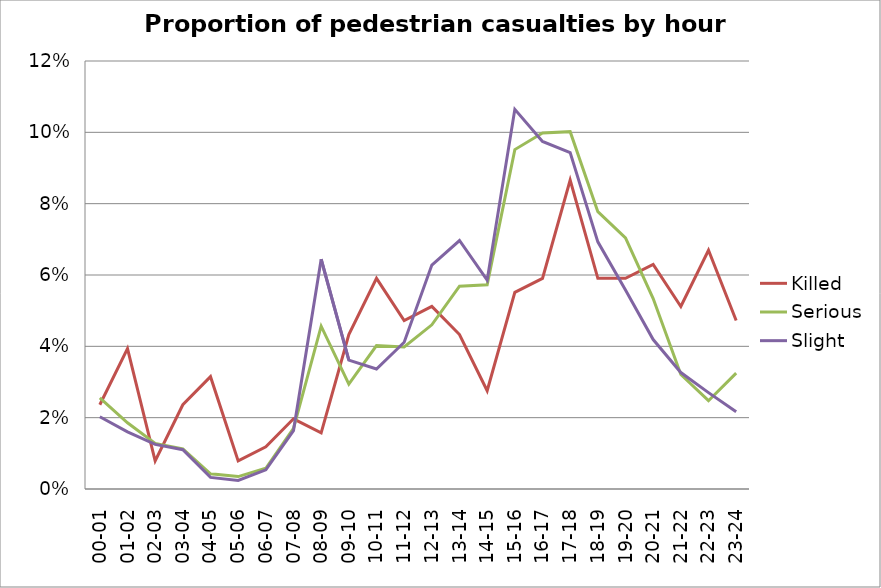
| Category | Killed | Serious | Slight |
|---|---|---|---|
| 00-01 | 0.024 | 0.026 | 0.02 |
| 01-02 | 0.039 | 0.019 | 0.016 |
| 02-03 | 0.008 | 0.013 | 0.013 |
| 03-04 | 0.024 | 0.011 | 0.011 |
| 04-05 | 0.031 | 0.004 | 0.003 |
| 05-06 | 0.008 | 0.003 | 0.002 |
| 06-07 | 0.012 | 0.006 | 0.005 |
| 07-08 | 0.02 | 0.017 | 0.016 |
| 08-09 | 0.016 | 0.046 | 0.064 |
| 09-10 | 0.043 | 0.029 | 0.036 |
| 10-11 | 0.059 | 0.04 | 0.034 |
| 11-12 | 0.047 | 0.04 | 0.041 |
| 12-13 | 0.051 | 0.046 | 0.063 |
| 13-14 | 0.043 | 0.057 | 0.07 |
| 14-15 | 0.028 | 0.057 | 0.059 |
| 15-16 | 0.055 | 0.095 | 0.106 |
| 16-17 | 0.059 | 0.1 | 0.097 |
| 17-18 | 0.087 | 0.1 | 0.094 |
| 18-19 | 0.059 | 0.078 | 0.069 |
| 19-20 | 0.059 | 0.07 | 0.056 |
| 20-21 | 0.063 | 0.053 | 0.042 |
| 21-22 | 0.051 | 0.032 | 0.033 |
| 22-23 | 0.067 | 0.025 | 0.027 |
| 23-24 | 0.047 | 0.032 | 0.022 |